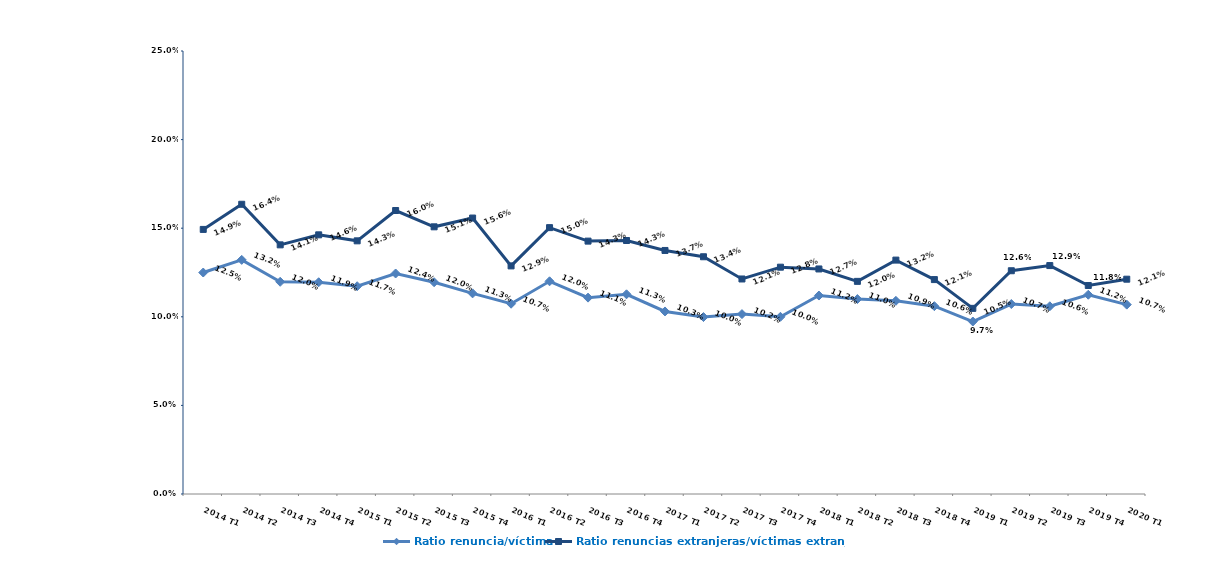
| Category | Ratio renuncia/víctima | Ratio renuncias extranjeras/víctimas extranjeras |
|---|---|---|
| 2014 T1 | 0.125 | 0.149 |
| 2014 T2 | 0.132 | 0.164 |
| 2014 T3 | 0.12 | 0.141 |
| 2014 T4 | 0.119 | 0.146 |
| 2015 T1 | 0.117 | 0.143 |
| 2015 T2 | 0.124 | 0.16 |
| 2015 T3 | 0.12 | 0.151 |
| 2015 T4 | 0.113 | 0.156 |
| 2016 T1 | 0.107 | 0.129 |
| 2016 T2 | 0.12 | 0.15 |
| 2016 T3 | 0.111 | 0.143 |
| 2016 T4 | 0.113 | 0.143 |
| 2017 T1 | 0.103 | 0.137 |
| 2017 T2 | 0.1 | 0.134 |
| 2017 T3 | 0.102 | 0.121 |
| 2017 T4 | 0.1 | 0.128 |
| 2018 T1 | 0.112 | 0.127 |
| 2018 T2 | 0.11 | 0.12 |
| 2018 T3 | 0.109 | 0.132 |
| 2018 T4 | 0.106 | 0.121 |
| 2019 T1 | 0.097 | 0.105 |
| 2019 T2 | 0.107 | 0.126 |
| 2019 T3 | 0.106 | 0.129 |
| 2019 T4 | 0.112 | 0.118 |
| 2020 T1 | 0.107 | 0.121 |